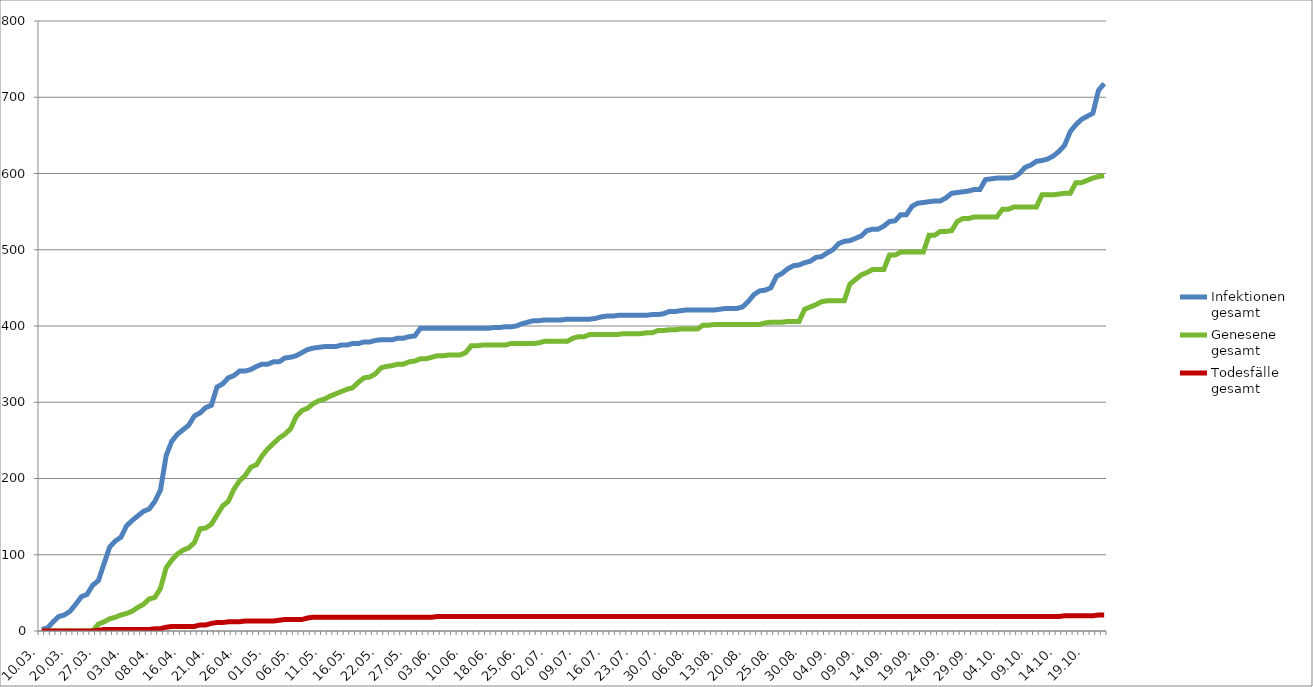
| Category | Infektionen
gesamt | Genesene
gesamt | Todesfälle
gesamt |
|---|---|---|---|
| 10.03. | 2 | 0 | 0 |
| 13.03. | 4 | 0 | 0 |
| 16.03. | 12 | 0 | 0 |
| 18.03. | 19 | 0 | 0 |
| 19.03. | 21 | 0 | 0 |
| 20.03. | 26 | 0 | 0 |
| 23.03. | 35 | 0 | 0 |
| 24.03. | 45 | 0 | 0 |
| 25.03. | 48 | 0 | 0 |
| 26.03. | 60 | 0 | 0 |
| 27.03. | 66 | 9 | 1 |
| 30.03. | 88 | 12 | 2 |
| 31.03. | 110 | 16 | 2 |
| 01.04. | 118 | 18 | 2 |
| 02.04. | 123 | 21 | 2 |
| 03.04. | 138 | 23 | 2 |
| 04.04. | 145 | 26 | 2 |
| 05.04. | 151 | 31 | 2 |
| 06.04. | 157 | 35 | 2 |
| 07.04. | 160 | 42 | 2 |
| 08.04. | 170 | 44 | 3 |
| 09.04. | 185 | 56 | 3 |
| 13.04. | 230 | 83 | 5 |
| 14.04. | 249 | 93 | 6 |
| 15.04. | 258 | 101 | 6 |
| 16.04. | 264 | 106 | 6 |
| 17.04. | 270 | 109 | 6 |
| 18.04. | 282 | 116 | 6 |
| 19.04. | 286 | 134 | 8 |
| 20.04. | 293 | 135 | 8 |
| 21.04. | 296 | 140 | 10 |
| 22.04. | 320 | 152 | 11 |
| 23.04. | 324 | 164 | 11 |
| 24.04. | 332 | 170 | 12 |
| 25.04. | 335 | 186 | 12 |
| 26.04. | 341 | 197 | 12 |
| 27.04. | 341 | 204 | 13 |
| 28.04. | 343 | 215 | 13 |
| 29.04. | 347 | 218 | 13 |
| 30.04. | 350 | 230 | 13 |
| 01.05. | 350 | 239 | 13 |
| 02.05. | 353 | 246 | 13 |
| 03.05. | 353 | 253 | 14 |
| 04.05. | 358 | 258 | 15 |
| 05.05. | 359 | 265 | 15 |
| 06.05. | 361 | 281 | 15 |
| 07.05. | 365 | 289 | 15 |
| 08.05. | 369 | 292 | 17 |
| 09.05. | 371 | 298 | 18 |
| 10.05. | 372 | 302 | 18 |
| 11.05. | 373 | 304 | 18 |
| 12.05. | 373 | 308 | 18 |
| 13.05. | 373 | 311 | 18 |
| 14.05. | 375 | 314 | 18 |
| 15.05. | 375 | 317 | 18 |
| 16.05. | 377 | 319 | 18 |
| 17.05. | 377 | 326 | 18 |
| 18.05. | 379 | 332 | 18 |
| 19.05. | 379 | 333 | 18 |
| 20.05. | 381 | 337 | 18 |
| 22.05. | 382 | 345 | 18 |
| 23.05. | 382 | 347 | 18 |
| 24.05. | 382 | 348 | 18 |
| 25.05. | 384 | 350 | 18 |
| 26.05. | 384 | 350 | 18 |
| 27.05. | 386 | 353 | 18 |
| 28.05. | 387 | 354 | 18 |
| 29.05. | 397 | 357 | 18 |
| 30.05. | 397 | 357 | 18 |
| 02.06. | 397 | 359 | 18 |
| 03.06. | 397 | 361 | 19 |
| 04.06. | 397 | 361 | 19 |
| 05.06. | 397 | 362 | 19 |
| 08.06. | 397 | 362 | 19 |
| 09.06. | 397 | 362 | 19 |
| 10.06. | 397 | 365 | 19 |
| 12.06. | 397 | 374 | 19 |
| 15.06. | 397 | 374 | 19 |
| 16.06. | 397 | 375 | 19 |
| 17.06. | 397 | 375 | 19 |
| 18.06. | 398 | 375 | 19 |
| 19.06. | 398 | 375 | 19 |
| 22.06. | 399 | 375 | 19 |
| 23.06. | 399 | 377 | 19 |
| 24.06. | 400 | 377 | 19 |
| 25.06. | 403 | 377 | 19 |
| 26.06. | 405 | 377 | 19 |
| 29.06. | 407 | 377 | 19 |
| 30.06. | 407 | 378 | 19 |
| 01.07. | 408 | 380 | 19 |
| 02.07. | 408 | 380 | 19 |
| 03.07. | 408 | 380 | 19 |
| 06.07. | 408 | 380 | 19 |
| 07.07. | 409 | 380 | 19 |
| 08.07. | 409 | 384 | 19 |
| 09.07. | 409 | 386 | 19 |
| 10.07. | 409 | 386 | 19 |
| 13.07. | 409 | 389 | 19 |
| 14.07. | 410 | 389 | 19 |
| 15.07. | 412 | 389 | 19 |
| 16.07. | 413 | 389 | 19 |
| 17.07. | 413 | 389 | 19 |
| 20.07. | 414 | 389 | 19 |
| 21.07. | 414 | 390 | 19 |
| 22.07. | 414 | 390 | 19 |
| 23.07. | 414 | 390 | 19 |
| 24.07. | 414 | 390 | 19 |
| 27.07. | 414 | 391 | 19 |
| 28.07. | 415 | 391 | 19 |
| 29.07. | 415 | 394 | 19 |
| 30.07. | 416 | 394 | 19 |
| 31.07. | 419 | 395 | 19 |
| 03.08. | 419 | 395 | 19 |
| 04.08. | 420 | 396 | 19 |
| 05.08. | 421 | 396 | 19 |
| 06.08. | 421 | 396 | 19 |
| 07.08. | 421 | 396 | 19 |
| 10.08. | 421 | 401 | 19 |
| 11.08. | 421 | 401 | 19 |
| 12.08. | 421 | 402 | 19 |
| 13.08. | 422 | 402 | 19 |
| 14.08. | 423 | 402 | 19 |
| 17.08. | 423 | 402 | 19 |
| 18.08. | 423 | 402 | 19 |
| 19.08. | 425 | 402 | 19 |
| 20.08. | 432 | 402 | 19 |
| 21.08. | 441 | 402 | 19 |
| 22.08. | 446 | 402 | 19 |
| 23.08. | 447 | 404 | 19 |
| 24.08. | 450 | 405 | 19 |
| 25.08. | 465 | 405 | 19 |
| 26.08. | 469 | 405 | 19 |
| 27.08. | 475 | 406 | 19 |
| 28.08. | 479 | 406 | 19 |
| 29.08. | 480 | 406 | 19 |
| 30.08. | 483 | 422 | 19 |
| 31.08. | 485 | 425 | 19 |
| 01.09. | 490 | 428 | 19 |
| 02.09. | 491 | 432 | 19 |
| 03.09. | 496 | 433 | 19 |
| 04.09. | 500 | 433 | 19 |
| 05.09. | 508 | 433 | 19 |
| 06.09. | 511 | 433 | 19 |
| 07.09. | 512 | 455 | 19 |
| 08.09. | 515 | 461 | 19 |
| 09.09. | 518 | 467 | 19 |
| 10.09. | 525 | 470 | 19 |
| 11.09. | 527 | 474 | 19 |
| 12.09. | 527 | 474 | 19 |
| 13.09. | 531 | 474 | 19 |
| 14.09. | 537 | 493 | 19 |
| 15.09. | 538 | 493 | 19 |
| 16.09. | 546 | 497 | 19 |
| 17.09. | 546 | 497 | 19 |
| 18.09. | 557 | 497 | 19 |
| 19.09. | 561 | 497 | 19 |
| 20.09. | 562 | 497 | 19 |
| 21.09. | 563 | 519 | 19 |
| 22.09. | 564 | 519 | 19 |
| 23.o9. | 564 | 524 | 19 |
| 24.09. | 568 | 524 | 19 |
| 25.09. | 574 | 525 | 19 |
| 26.09. | 575 | 537 | 19 |
| 27.09. | 576 | 541 | 19 |
| 28.09. | 577 | 541 | 19 |
| 29.09. | 579 | 543 | 19 |
| 30.09. | 579 | 543 | 19 |
| 01.10. | 592 | 543 | 19 |
| 02.10. | 593 | 543 | 19 |
| 03.10. | 594 | 543 | 19 |
| 04.10. | 594 | 553 | 19 |
| 05.10. | 594 | 553 | 19 |
| 06.10. | 595 | 556 | 19 |
| 07.10. | 600 | 556 | 19 |
| 08.10. | 608 | 556 | 19 |
| 09.10. | 611 | 556 | 19 |
| 10.10. | 616 | 556 | 19 |
| 11.10. | 617 | 572 | 19 |
| 12.10. | 619 | 572 | 19 |
| 13.10. | 623 | 572 | 19 |
| 14.10. | 629 | 573 | 19 |
| 15.10. | 637 | 574 | 20 |
| 16.10. | 655 | 574 | 20 |
| 17.10. | 664 | 588 | 20 |
| 18.10. | 671 | 588 | 20 |
| 19.10. | 675 | 591 | 20 |
| 20.10. | 679 | 594 | 20 |
| 21.10. | 709 | 596 | 21 |
| 22.10. | 718 | 597 | 21 |